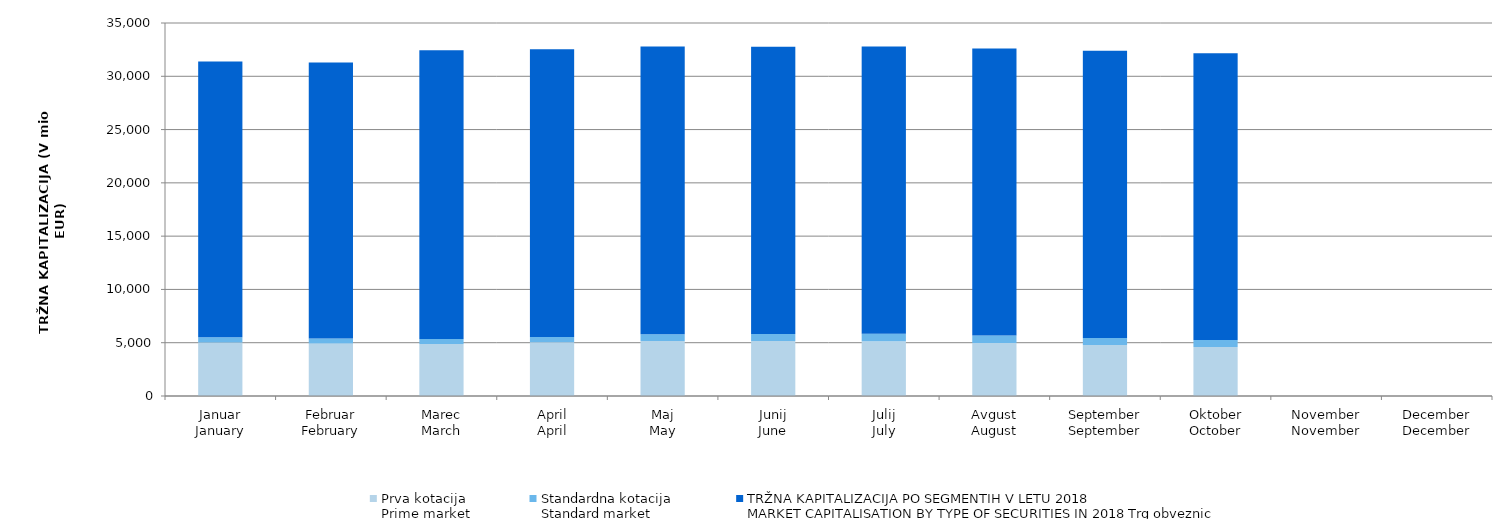
| Category | Prva kotacija
Prime market | Standardna kotacija
Standard market | Series 3 |
|---|---|---|---|
| Januar
January | 5022.792 | 483.67 | 25885.901 |
| Februar
February | 4922.405 | 471.165 | 25899.375 |
| Marec
March | 4884.025 | 463.212 | 27099.633 |
| April
April | 5038.448 | 492.653 | 27015.924 |
| Maj
May | 5153.368 | 630.304 | 27015.655 |
| Junij
June | 5151.963 | 663.065 | 26962.481 |
| Julij
July | 5126.931 | 703.136 | 26961.579 |
| Avgust
August | 4963.893 | 702.004 | 26952.115 |
| September
September | 4788.635 | 655.294 | 26952.079 |
| Oktober
October | 4601.278 | 658.399 | 26904.943 |
| November
November | 0 | 0 | 0 |
| December
December | 0 | 0 | 0 |